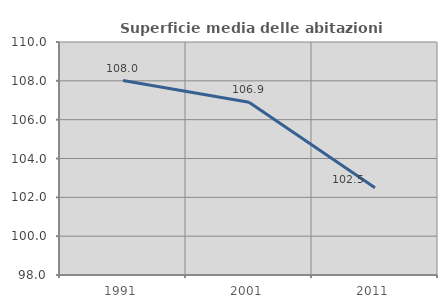
| Category | Superficie media delle abitazioni occupate |
|---|---|
| 1991.0 | 108.016 |
| 2001.0 | 106.898 |
| 2011.0 | 102.499 |